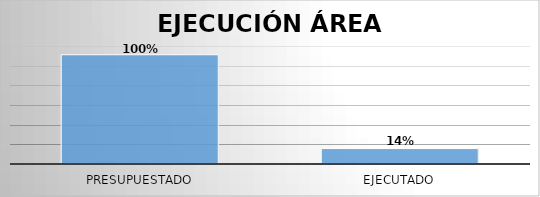
| Category | Series 0 |
|---|---|
| Presupuestado | 5555120152 |
| Ejecutado | 785589780 |